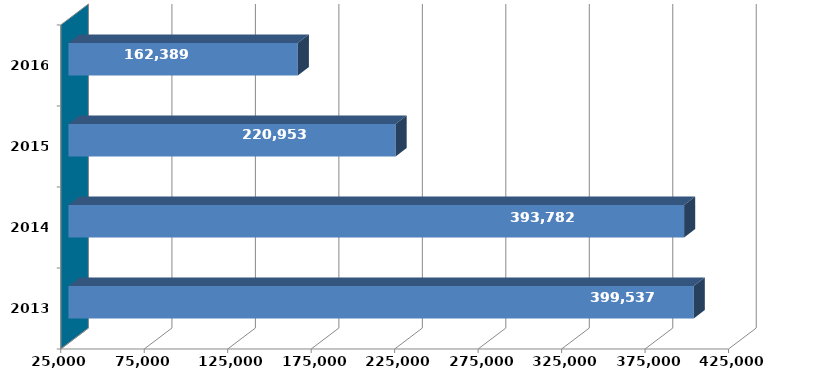
| Category | Column2 |
|---|---|
| 2013 | 399536549 |
| 2014 | 393782069 |
| 2015 | 220952703 |
| 2016 | 162388931 |